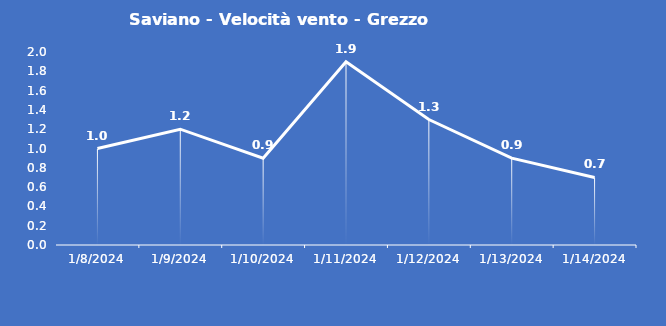
| Category | Saviano - Velocità vento - Grezzo (m/s) |
|---|---|
| 1/8/24 | 1 |
| 1/9/24 | 1.2 |
| 1/10/24 | 0.9 |
| 1/11/24 | 1.9 |
| 1/12/24 | 1.3 |
| 1/13/24 | 0.9 |
| 1/14/24 | 0.7 |